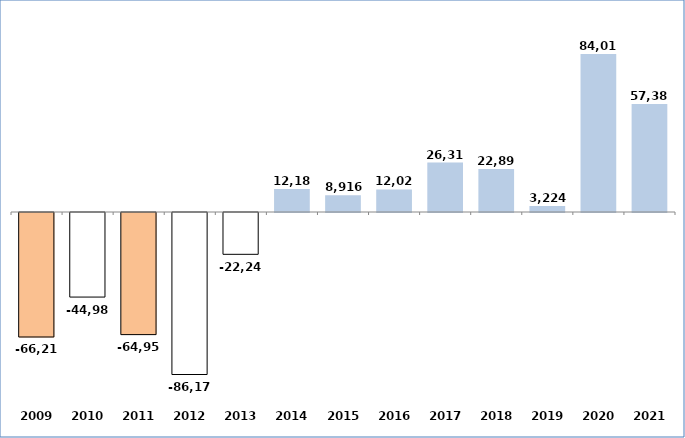
| Category | Series 0 |
|---|---|
| 2009 | -66215.49 |
| 2010 | -44984.64 |
| 2011 | -64955.74 |
| 2012 | -86173.75 |
| 2013 | -22241.8 |
| 2014 | 12182.45 |
| 2015 | 8916.1 |
| 2016 | 12025.4 |
| 2017 | 26317.56 |
| 2018 | 22899.03 |
| 2019 | 3224 |
| 2020 | 84013 |
| 2021 | 57387.273 |